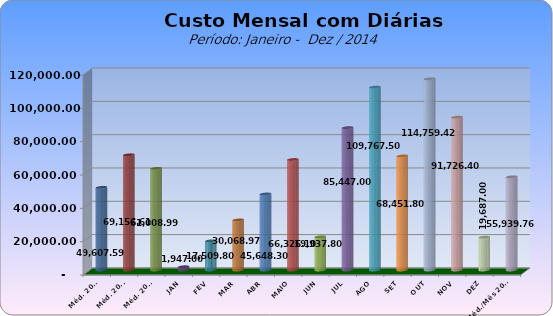
| Category | Series 0 |
|---|---|
| Méd. 2011 | 49607.59 |
| Méd. 2012 | 69156.61 |
| Méd. 2013 | 61008.99 |
| JAN | 1947 |
| FEV | 17509.8 |
| MAR | 30068.97 |
| ABR | 45648.3 |
| MAIO | 66326.1 |
| JUN | 19937.8 |
| JUL | 85447 |
| AGO | 109767.5 |
| SET | 68451.8 |
| OUT | 114759.42 |
| NOV | 91726.4 |
| DEZ | 19687 |
| Méd./Mês 2014 | 55939.758 |